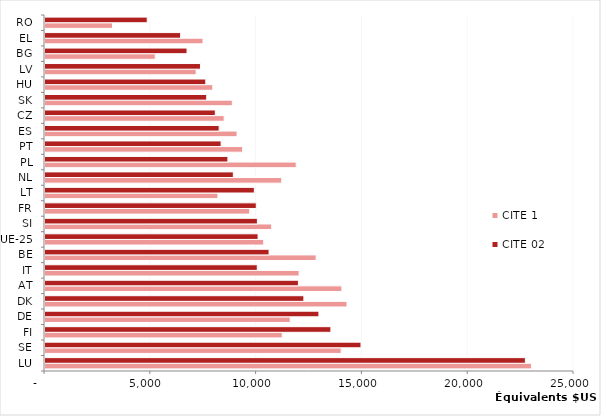
| Category | CITE 1 | CITE 02 |
|---|---|---|
| LU | 22990.23 | 22702.08 |
| SE | 13997.47 | 14933.86 |
| FI | 11212.19 | 13510.5 |
| DE | 11587.35 | 12945.5 |
| DK | 14272.99 | 12234.27 |
| AT | 14029.22 | 11976.52 |
| IT | 12008.45 | 10031.64 |
| BE | 12813 | 10588.9 |
| UE-25 | 10336.763 | 10069.56 |
| SI | 10713.73 | 10037.56 |
| FR | 9673.323 | 9985.625 |
| LT | 8173.222 | 9893.688 |
| NL | 11188.04 | 8900.585 |
| PL | 11871.78 | 8644.35 |
| PT | 9339.703 | 8322.126 |
| ES | 9077.22 | 8230.188 |
| CZ | 8466.04 | 8048.433 |
| SK | 8853.065 | 7642.44 |
| HU | 7928.497 | 7599.821 |
| LV | 7142.312 | 7347.931 |
| BG | 5211.253 | 6711.624 |
| EL | 7466.902 | 6410.805 |
| RO | 3188.262 | 4831.879 |